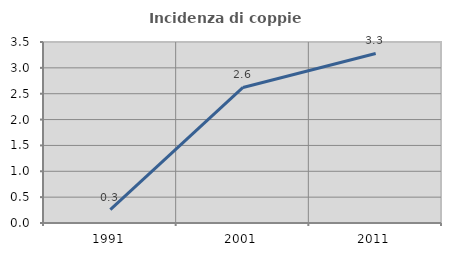
| Category | Incidenza di coppie miste |
|---|---|
| 1991.0 | 0.257 |
| 2001.0 | 2.621 |
| 2011.0 | 3.279 |